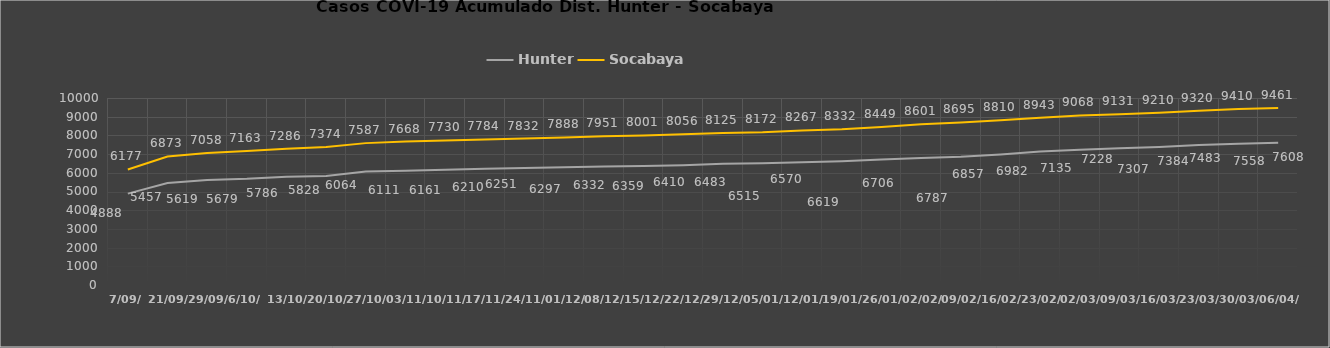
| Category | Hunter | Socabaya |
|---|---|---|
| 7/09/ | 4888 | 6177 |
| 21/09/ | 5457 | 6873 |
| 29/09/ | 5619 | 7058 |
| 6/10/ | 5679 | 7163 |
| 13/10/ | 5786 | 7286 |
| 20/10/ | 5828 | 7374 |
| 27/10/ | 6064 | 7587 |
| 03/11/ | 6111 | 7668 |
| 10/11/ | 6161 | 7730 |
| 17/11/ | 6210 | 7784 |
| 24/11/ | 6251 | 7832 |
| 01/12/ | 6297 | 7888 |
| 08/12/ | 6332 | 7951 |
| 15/12/ | 6359 | 8001 |
| 22/12/ | 6410 | 8056 |
| 29/12/ | 6483 | 8125 |
| 05/01/ | 6515 | 8172 |
| 12/01/ | 6570 | 8267 |
| 19/01/ | 6619 | 8332 |
| 26/01/ | 6706 | 8449 |
| 02/02/ | 6787 | 8601 |
| 09/02/ | 6857 | 8695 |
| 16/02/ | 6982 | 8810 |
| 23/02/ | 7135 | 8943 |
| 02/03/ | 7228 | 9068 |
| 09/03/ | 7307 | 9131 |
| 16/03/ | 7384 | 9210 |
| 23/03/ | 7483 | 9320 |
| 30/03/ | 7558 | 9410 |
| 06/04/ | 7608 | 9461 |